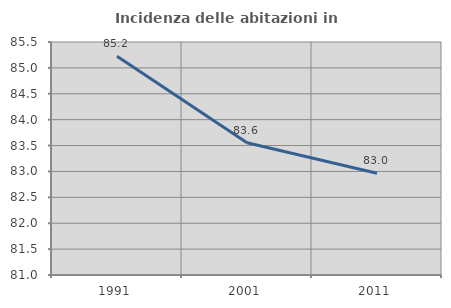
| Category | Incidenza delle abitazioni in proprietà  |
|---|---|
| 1991.0 | 85.225 |
| 2001.0 | 83.554 |
| 2011.0 | 82.965 |